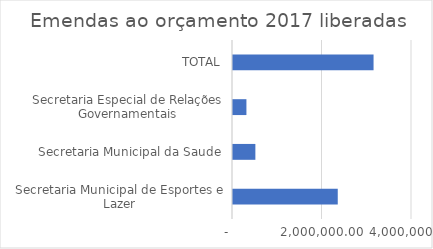
| Category | Series 0 |
|---|---|
| Secretaria Municipal de Esportes e Lazer | 2340901 |
| Secretaria Municipal da Saude | 500000 |
| Secretaria Especial de Relações Governamentais | 300000 |
| TOTAL | 3140901 |